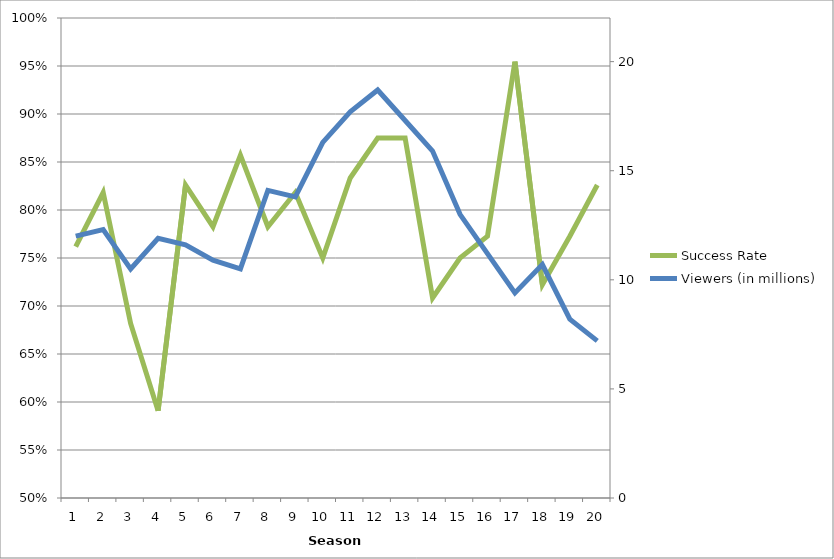
| Category | Success Rate |
|---|---|
| 0 | 0.762 |
| 1 | 0.818 |
| 2 | 0.682 |
| 3 | 0.591 |
| 4 | 0.826 |
| 5 | 0.783 |
| 6 | 0.857 |
| 7 | 0.783 |
| 8 | 0.818 |
| 9 | 0.75 |
| 10 | 0.833 |
| 11 | 0.875 |
| 12 | 0.875 |
| 13 | 0.708 |
| 14 | 0.75 |
| 15 | 0.773 |
| 16 | 0.955 |
| 17 | 0.722 |
| 18 | 0.773 |
| 19 | 0.826 |